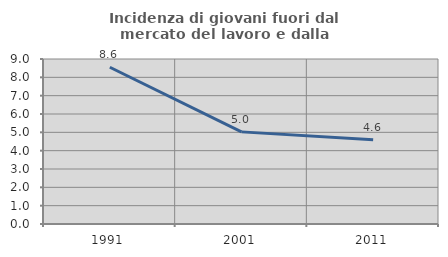
| Category | Incidenza di giovani fuori dal mercato del lavoro e dalla formazione  |
|---|---|
| 1991.0 | 8.551 |
| 2001.0 | 5.025 |
| 2011.0 | 4.597 |